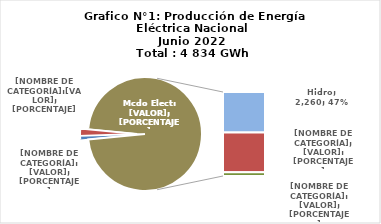
| Category | Series 0 |
|---|---|
| 0 | 49.068 |
| 1 | 99.622 |
| 2 | 2260.333 |
| 3 | 2213.767 |
| 4 | 210.917 |